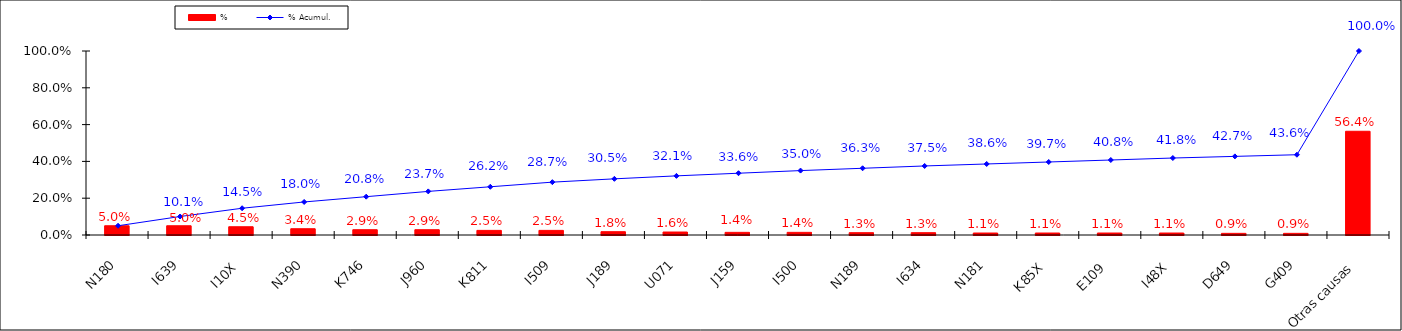
| Category | % |
|---|---|
| N180 | 0.05 |
| I639 | 0.05 |
| I10X | 0.045 |
| N390 | 0.034 |
| K746 | 0.029 |
| J960 | 0.029 |
| K811 | 0.025 |
| I509 | 0.025 |
| J189 | 0.018 |
| U071 | 0.016 |
| J159 | 0.014 |
| I500 | 0.014 |
| N189 | 0.013 |
| I634 | 0.013 |
| N181 | 0.011 |
| K85X | 0.011 |
| E109 | 0.011 |
| I48X | 0.011 |
| D649 | 0.009 |
| G409 | 0.009 |
| Otras causas | 0.564 |